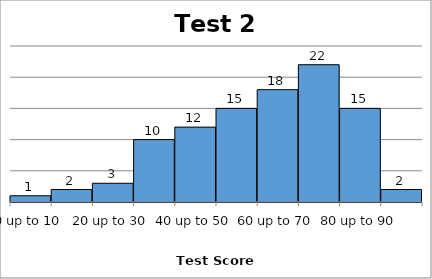
| Category | Frequency |
|---|---|
| 0 up to 10 | 1 |
| 10 up to 20 | 2 |
| 20 up to 30 | 3 |
| 30 up to 40 | 10 |
| 40 up to 50 | 12 |
| 50 up to 60 | 15 |
| 60 up to 70 | 18 |
| 70 up to 80 | 22 |
| 80 up to 90 | 15 |
| 90 up to 100 | 2 |